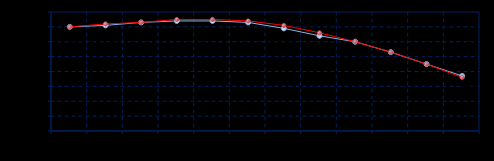
| Category | Series 0 | Series 1 |
|---|---|---|
| Mar 15 | 99.95 | 99.95 |
| Jun 15 | 99.955 | 99.96 |
| Sep 15 | 99.965 | 99.965 |
| Dec 15 | 99.97 | 99.975 |
| Mar 16 | 99.97 | 99.975 |
| Jun 16 | 99.965 | 99.97 |
| Sep 16 | 99.945 | 99.955 |
| Dec 16 | 99.92 | 99.93 |
| Mar 17 | 99.9 | 99.9 |
| Jun 17 | 99.865 | 99.865 |
| Sep 17 | 99.825 | 99.825 |
| Dec 17 | 99.785 | 99.78 |